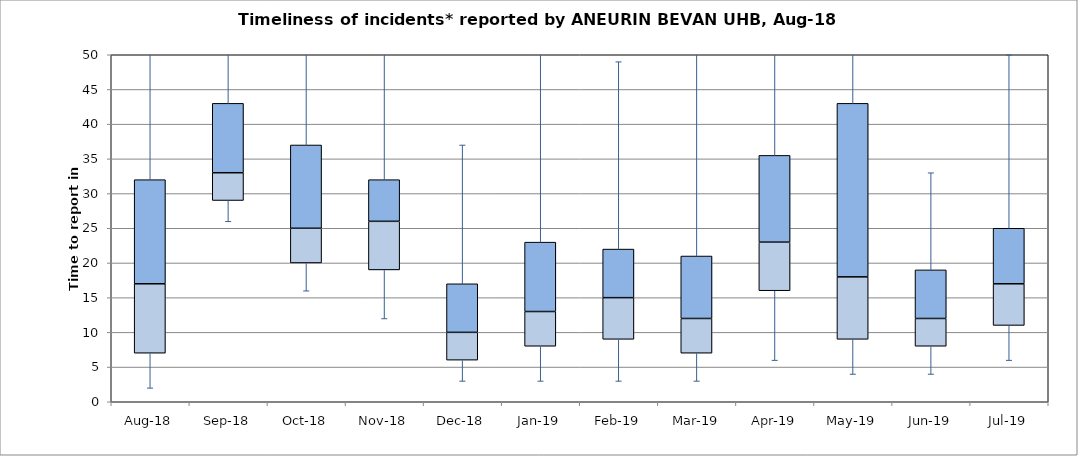
| Category | Series 0 | Series 1 | Series 2 |
|---|---|---|---|
| Aug-18 | 7 | 10 | 15 |
| Sep-18 | 29 | 4 | 10 |
| Oct-18 | 20 | 5 | 12 |
| Nov-18 | 19 | 7 | 6 |
| Dec-18 | 6 | 4 | 7 |
| Jan-19 | 8 | 5 | 10 |
| Feb-19 | 9 | 6 | 7 |
| Mar-19 | 7 | 5 | 9 |
| Apr-19 | 16 | 7 | 12.5 |
| May-19 | 9 | 9 | 25 |
| Jun-19 | 8 | 4 | 7 |
| Jul-19 | 11 | 6 | 8 |